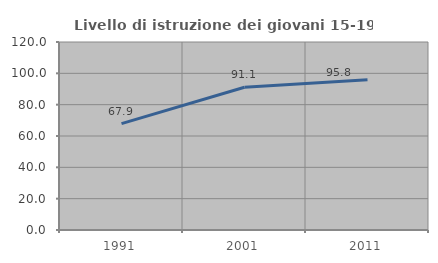
| Category | Livello di istruzione dei giovani 15-19 anni |
|---|---|
| 1991.0 | 67.931 |
| 2001.0 | 91.091 |
| 2011.0 | 95.837 |